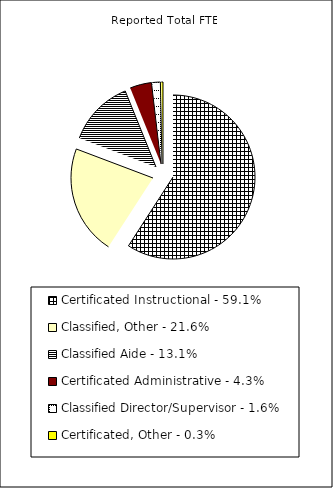
| Category | Reported FTE |
|---|---|
| Certificated Instructional - 59.1% | 73965.65 |
| Classified, Other - 21.6% | 27044.91 |
| Classified Aide - 13.1% | 16409.61 |
| Certificated Administrative - 4.3% | 5333.54 |
| Classified Director/Supervisor - 1.6% | 1930.81 |
| Certificated, Other - 0.3% | 393.17 |